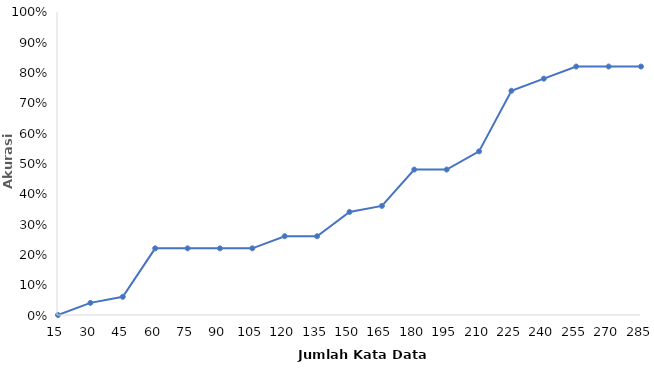
| Category | Series 0 |
|---|---|
| 15 | 0 |
| 30 | 0.04 |
| 45 | 0.06 |
| 60 | 0.22 |
| 75 | 0.22 |
| 90 | 0.22 |
| 105 | 0.22 |
| 120 | 0.26 |
| 135 | 0.26 |
| 150 | 0.34 |
| 165 | 0.36 |
| 180 | 0.48 |
| 195 | 0.48 |
| 210 | 0.54 |
| 225 | 0.74 |
| 240 | 0.78 |
| 255 | 0.82 |
| 270 | 0.82 |
| 285 | 0.82 |